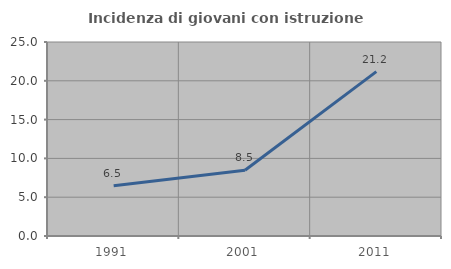
| Category | Incidenza di giovani con istruzione universitaria |
|---|---|
| 1991.0 | 6.475 |
| 2001.0 | 8.475 |
| 2011.0 | 21.186 |